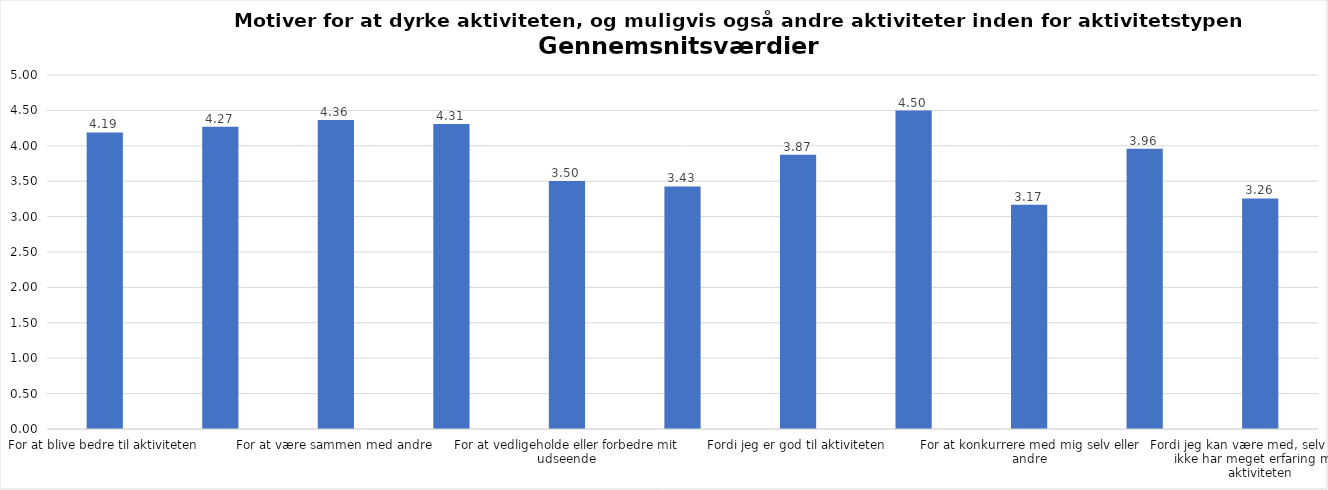
| Category | Gennemsnit |
|---|---|
| For at blive bedre til aktiviteten | 4.19 |
| For at vedligeholde eller forbedre min sundhed (fx helbred, fysisk form) | 4.268 |
| For at være sammen med andre | 4.363 |
| For at gøre noget godt for mig selv | 4.309 |
| For at vedligeholde eller forbedre mit udseende | 3.502 |
| Fordi andre i min omgangskreds opmuntrer mig til det | 3.427 |
| Fordi jeg er god til aktiviteten | 3.873 |
| Fordi jeg godt kan lide aktiviteten | 4.497 |
| For at konkurrere med mig selv eller andre | 3.166 |
| Fordi aktiviteten passer godt ind i min hverdag | 3.958 |
| Fordi jeg kan være med, selv om jeg ikke har meget erfaring med aktiviteten | 3.256 |